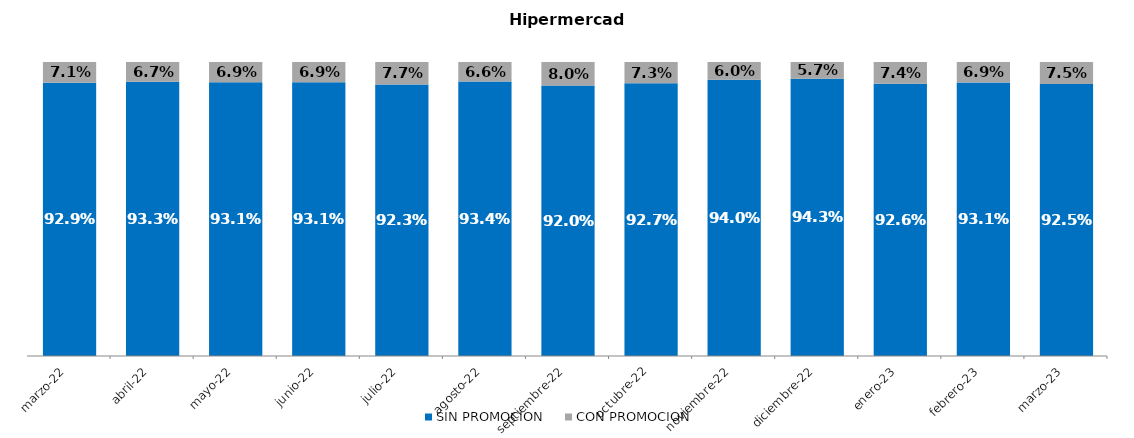
| Category | SIN PROMOCION   | CON PROMOCION   |
|---|---|---|
| 2022-03-01 | 0.929 | 0.071 |
| 2022-04-01 | 0.933 | 0.067 |
| 2022-05-01 | 0.931 | 0.069 |
| 2022-06-01 | 0.931 | 0.069 |
| 2022-07-01 | 0.923 | 0.077 |
| 2022-08-01 | 0.934 | 0.066 |
| 2022-09-01 | 0.92 | 0.08 |
| 2022-10-01 | 0.927 | 0.073 |
| 2022-11-01 | 0.94 | 0.06 |
| 2022-12-01 | 0.943 | 0.057 |
| 2023-01-01 | 0.926 | 0.074 |
| 2023-02-01 | 0.931 | 0.069 |
| 2023-03-01 | 0.925 | 0.075 |